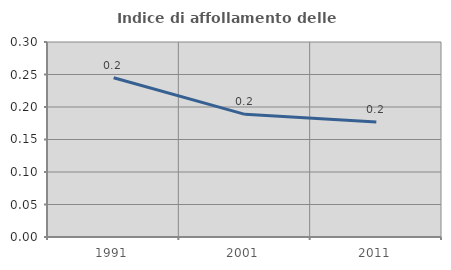
| Category | Indice di affollamento delle abitazioni  |
|---|---|
| 1991.0 | 0.245 |
| 2001.0 | 0.189 |
| 2011.0 | 0.177 |